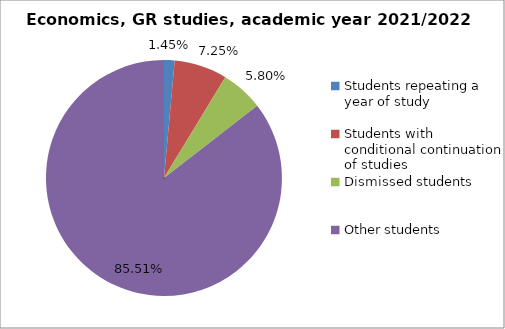
| Category | Series 0 |
|---|---|
| Students repeating a year of study | 1 |
| Students with conditional continuation of studies | 5 |
| Dismissed students | 4 |
| Other students | 59 |